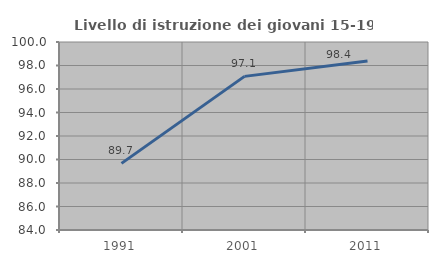
| Category | Livello di istruzione dei giovani 15-19 anni |
|---|---|
| 1991.0 | 89.668 |
| 2001.0 | 97.074 |
| 2011.0 | 98.377 |